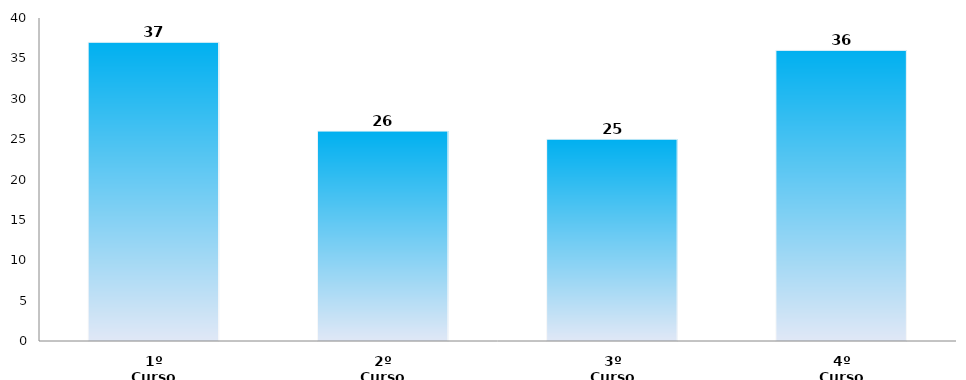
| Category | Series 0 |
|---|---|
| 1º Curso | 37 |
| 2º Curso | 26 |
| 3º Curso | 25 |
| 4º Curso | 36 |